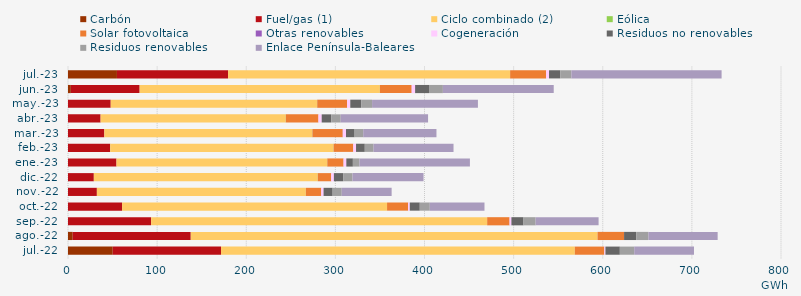
| Category | Carbón | Fuel/gas (1) | Ciclo combinado (2) | Eólica | Solar fotovoltaica | Otras renovables | Cogeneración | Residuos no renovables | Residuos renovables | Enlace Península-Baleares |
|---|---|---|---|---|---|---|---|---|---|---|
| jul.-22 | 50.189 | 121.497 | 396.96 | 0.03 | 33.07 | 0.095 | 1.172 | 16.161 | 16.161 | 67.033 |
| ago.-22 | 5.265 | 132.469 | 456.377 | 0.032 | 29.671 | 0.057 | 0.051 | 13.672 | 13.672 | 77.653 |
| sep.-22 | -0.604 | 93.246 | 377.074 | 0.013 | 25.078 | 0.072 | 2.037 | 13.582 | 13.582 | 70.647 |
| oct.-22 | -0.613 | 60.669 | 297.321 | 0.003 | 23.564 | 0.097 | 1.827 | 11.231 | 11.231 | 61.365 |
| nov.-22 | -0.588 | 32.394 | 234.48 | 0.026 | 17.218 | 0.085 | 2.554 | 10.189 | 10.189 | 55.992 |
| dic.-22 | -0.627 | 28.98 | 251.185 | 0.101 | 15.034 | 0.077 | 2.941 | 10.414 | 10.414 | 79.779 |
| ene.-23 | -0.728 | 54.403 | 236.334 | 0.216 | 18.177 | 0.094 | 3.056 | 7.362 | 7.362 | 123.95 |
| feb.-23 | -0.707 | 47.337 | 250.507 | 0.183 | 21.959 | 0.136 | 3.052 | 9.83 | 9.83 | 89.734 |
| mar.-23 | -0.518 | 40.752 | 233.282 | 0.2 | 34.018 | 0.112 | 3.586 | 9.638 | 9.638 | 82.194 |
| abr.-23 | -0.609 | 36.577 | 207.738 | 0.127 | 36.519 | 0.074 | 3.62 | 10.657 | 10.657 | 98.033 |
| may.-23 | -0.833 | 47.925 | 231.475 | 0.25 | 33.46 | 0.09 | 3.518 | 12.229 | 12.229 | 118.762 |
| jun.-23 | 3.18 | 77.204 | 269.55 | 0.056 | 35.587 | 0.084 | 3.789 | 15.598 | 15.598 | 124.35 |
| jul.-23 | 54.925 | 124.683 | 316.355 | 0.119 | 40.355 | 0.037 | 3.245 | 12.541 | 12.541 | 168.548 |